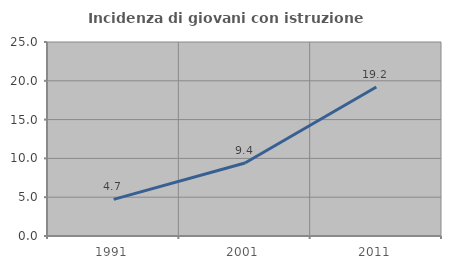
| Category | Incidenza di giovani con istruzione universitaria |
|---|---|
| 1991.0 | 4.719 |
| 2001.0 | 9.414 |
| 2011.0 | 19.198 |